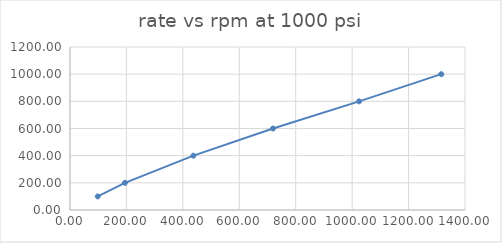
| Category | Series 0 |
|---|---|
| 98.36065573770492 | 100 |
| 194.70404984423675 | 200 |
| 437.4772147283996 | 400 |
| 719.5682590445732 | 600 |
| 1024.5265445513814 | 800 |
| 1315.9698423577793 | 1000 |